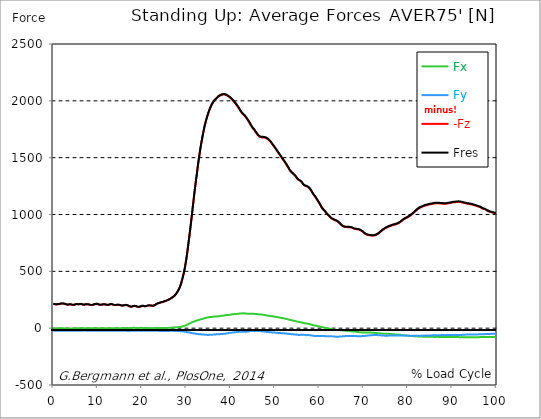
| Category |  Fx |  Fy |  -Fz |  Fres |
|---|---|---|---|---|
| 0.0 | -2.037 | -22.786 | 213.212 | 214.551 |
| 0.167348456675344 | -2.209 | -22.912 | 212.468 | 213.819 |
| 0.334696913350688 | -2.369 | -22.958 | 210.385 | 211.759 |
| 0.5020453700260321 | -2.129 | -22.763 | 208.932 | 210.294 |
| 0.669393826701376 | -1.762 | -22.511 | 208.783 | 210.111 |
| 0.83674228337672 | -1.511 | -22.271 | 209.825 | 211.118 |
| 1.0040907400520642 | -1.568 | -22.088 | 210.431 | 211.69 |
| 1.1621420602454444 | -1.534 | -21.848 | 210.065 | 211.29 |
| 1.3294905169207885 | -1.236 | -21.676 | 211.381 | 212.571 |
| 1.4968389735961325 | -1.019 | -21.676 | 213.727 | 214.883 |
| 1.6641874302714765 | -0.881 | -21.79 | 216.279 | 217.424 |
| 1.8315358869468206 | -1.053 | -21.859 | 217.103 | 218.259 |
| 1.9988843436221646 | -1.282 | -21.951 | 216.817 | 217.996 |
| 2.1662328002975086 | -1.293 | -21.996 | 215.982 | 217.161 |
| 2.333581256972853 | -1.362 | -22.065 | 215.776 | 216.977 |
| 2.5009297136481967 | -1.728 | -22.122 | 214.711 | 215.925 |
| 2.6682781703235405 | -2.312 | -22.157 | 212.217 | 213.464 |
| 2.8356266269988843 | -2.77 | -22.134 | 209.493 | 210.763 |
| 3.002975083674229 | -2.987 | -22.145 | 207.501 | 208.795 |
| 3.1703235403495724 | -2.884 | -22.088 | 206.403 | 207.719 |
| 3.337671997024917 | -2.792 | -22.054 | 206.368 | 207.684 |
| 3.4957233172182973 | -2.792 | -22.134 | 207.913 | 209.23 |
| 3.663071773893641 | -2.815 | -22.248 | 209.31 | 210.626 |
| 3.8304202305689854 | -3.033 | -22.328 | 209.378 | 210.694 |
| 3.997768687244329 | -3.25 | -22.328 | 208.131 | 209.458 |
| 4.165117143919673 | -3.479 | -22.305 | 206.117 | 207.444 |
| 4.332465600595017 | -3.41 | -22.157 | 204.388 | 205.716 |
| 4.499814057270361 | -3.09 | -21.905 | 203.713 | 205.006 |
| 4.667162513945706 | -2.449 | -21.642 | 204.938 | 206.162 |
| 4.834510970621049 | -1.74 | -21.516 | 207.25 | 208.428 |
| 5.001859427296393 | -1.431 | -21.687 | 209.79 | 210.969 |
| 5.169207883971737 | -1.316 | -21.825 | 211.69 | 212.869 |
| 5.336556340647081 | -1.442 | -21.905 | 212.159 | 213.35 |
| 5.503904797322425 | -1.545 | -21.985 | 211.221 | 212.434 |
| 5.671253253997769 | -1.568 | -22.065 | 209.676 | 210.912 |
| 5.82930457419115 | -1.179 | -21.996 | 209.47 | 210.694 |
| 5.996653030866494 | -0.721 | -21.882 | 211.438 | 212.64 |
| 6.164001487541838 | -0.492 | -21.825 | 213.269 | 214.46 |
| 6.331349944217181 | -0.824 | -21.859 | 212.732 | 213.922 |
| 6.498698400892526 | -1.282 | -21.916 | 210.042 | 211.267 |
| 6.66604685756787 | -1.408 | -21.859 | 206.78 | 208.028 |
| 6.833395314243213 | -1.099 | -21.699 | 205.338 | 206.586 |
| 7.000743770918558 | -0.629 | -21.516 | 205.659 | 206.872 |
| 7.168092227593902 | -0.183 | -21.504 | 208.028 | 209.218 |
| 7.335440684269246 | -0.149 | -21.642 | 210.099 | 211.301 |
| 7.50278914094459 | -0.229 | -21.687 | 211.026 | 212.228 |
| 7.6701375976199335 | -0.71 | -21.813 | 210.065 | 211.301 |
| 7.837486054295278 | -0.984 | -21.928 | 208.966 | 210.237 |
| 7.995537374488658 | -1.247 | -22.054 | 208.383 | 209.687 |
| 8.162885831164003 | -1.316 | -22.122 | 205.373 | 206.689 |
| 8.330234287839346 | -1.282 | -22.145 | 203.221 | 204.56 |
| 8.49758274451469 | -0.973 | -22.134 | 202.431 | 203.759 |
| 8.664931201190035 | -0.572 | -22.099 | 202.603 | 203.908 |
| 8.832279657865378 | -0.286 | -22.145 | 204.24 | 205.521 |
| 8.999628114540721 | 0 | -22.122 | 205.865 | 207.112 |
| 9.166976571216066 | 0.401 | -22.111 | 208.325 | 209.55 |
| 9.334325027891412 | 0.687 | -22.088 | 211.106 | 212.32 |
| 9.501673484566755 | 0.664 | -22.145 | 212.606 | 213.807 |
| 9.669021941242098 | 0.584 | -22.088 | 213.819 | 215.009 |
| 9.836370397917442 | 0.263 | -22.191 | 214.002 | 215.215 |
| 10.003718854592787 | -0.378 | -22.42 | 212.789 | 214.048 |
| 10.17106731126813 | -1.133 | -22.637 | 209.859 | 211.175 |
| 10.329118631461512 | -1.545 | -22.66 | 206.769 | 208.119 |
| 10.496467088136853 | -1.545 | -22.592 | 205.27 | 206.643 |
| 10.663815544812199 | -1.419 | -22.534 | 204.709 | 206.082 |
| 10.831164001487544 | -1.225 | -22.42 | 205.556 | 206.918 |
| 10.998512458162887 | -1.041 | -22.42 | 207.204 | 208.554 |
| 11.16586091483823 | -0.916 | -22.489 | 209.184 | 210.534 |
| 11.333209371513574 | -1.03 | -22.5 | 209.607 | 210.969 |
| 11.50055782818892 | -1.122 | -22.408 | 208.978 | 210.328 |
| 11.667906284864264 | -1.213 | -22.42 | 208.818 | 210.157 |
| 11.835254741539607 | -1.373 | -22.443 | 207.227 | 208.577 |
| 12.00260319821495 | -1.362 | -22.557 | 204.938 | 206.323 |
| 12.169951654890292 | -1.144 | -22.557 | 203.679 | 205.064 |
| 12.337300111565641 | -0.629 | -22.5 | 203.61 | 204.972 |
| 12.504648568240984 | -0.252 | -22.397 | 205.018 | 206.357 |
| 12.662699888434362 | 0.172 | -22.408 | 207.536 | 208.84 |
| 12.830048345109708 | 0.343 | -22.603 | 210.214 | 211.518 |
| 12.997396801785053 | 0.298 | -22.798 | 211.667 | 212.983 |
| 13.164745258460396 | 0.114 | -22.923 | 210.672 | 212.011 |
| 13.33209371513574 | -0.24 | -23.21 | 208.589 | 209.996 |
| 13.499442171811083 | -0.492 | -23.484 | 205.819 | 207.295 |
| 13.666790628486426 | -0.412 | -23.587 | 203.461 | 204.972 |
| 13.834139085161771 | -0.149 | -23.576 | 202.271 | 203.793 |
| 14.001487541837117 | 0.137 | -23.541 | 202.225 | 203.748 |
| 14.16883599851246 | 0.355 | -23.541 | 203.427 | 204.938 |
| 14.336184455187803 | 0.458 | -23.622 | 205.167 | 206.677 |
| 14.503532911863147 | 0.332 | -23.656 | 205.739 | 207.261 |
| 14.670881368538492 | 0.16 | -23.667 | 205.041 | 206.574 |
| 14.828932688731873 | 0.057 | -23.793 | 204.697 | 206.254 |
| 14.996281145407215 | -0.023 | -23.713 | 203.439 | 204.984 |
| 15.163629602082558 | -0.08 | -23.702 | 201.207 | 202.752 |
| 15.330978058757903 | 0.229 | -23.644 | 198.884 | 200.44 |
| 15.498326515433247 | 0.526 | -23.438 | 197.716 | 199.227 |
| 15.665674972108594 | 1.019 | -23.278 | 198.048 | 199.525 |
| 15.833023428783937 | 1.453 | -23.084 | 199.513 | 200.932 |
| 16.00037188545928 | 1.968 | -23.095 | 201.653 | 203.049 |
| 16.167720342134626 | 1.923 | -23.37 | 203.393 | 204.8 |
| 16.335068798809967 | 1.637 | -23.622 | 203.576 | 205.018 |
| 16.502417255485312 | 1.225 | -23.896 | 202.18 | 203.656 |
| 16.669765712160658 | 1.053 | -24.102 | 201.321 | 202.821 |
| 16.837114168836 | 0.664 | -24.171 | 198.495 | 200.04 |
| 17.004462625511344 | 0.263 | -24.148 | 194.878 | 196.457 |
| 17.16251394570472 | 0.172 | -23.976 | 191.445 | 193.047 |
| 17.32986240238007 | 0.412 | -23.702 | 189.167 | 190.747 |
| 17.497210859055414 | 1.019 | -23.267 | 188.069 | 189.602 |
| 17.664559315730756 | 1.659 | -22.855 | 189.087 | 190.552 |
| 17.8319077724061 | 2.335 | -22.523 | 191.33 | 192.738 |
| 17.999256229081443 | 2.941 | -22.34 | 193.699 | 195.073 |
| 18.166604685756788 | 2.964 | -22.408 | 195.336 | 196.698 |
| 18.333953142432133 | 2.792 | -22.466 | 195.771 | 197.144 |
| 18.501301599107478 | 2.461 | -22.534 | 195.164 | 196.537 |
| 18.668650055782823 | 1.946 | -22.614 | 193.093 | 194.5 |
| 18.835998512458165 | 1.545 | -22.569 | 190.312 | 191.731 |
| 19.00334696913351 | 1.236 | -22.431 | 187.473 | 188.893 |
| 19.170695425808855 | 1.362 | -22.214 | 185.917 | 187.325 |
| 19.338043882484197 | 1.808 | -21.905 | 186.008 | 187.37 |
| 19.496095202677576 | 2.243 | -21.71 | 188.137 | 189.476 |
| 19.66344365935292 | 2.644 | -21.607 | 190.918 | 192.223 |
| 19.830792116028263 | 2.724 | -21.825 | 194.077 | 195.393 |
| 19.998140572703612 | 2.564 | -21.974 | 195.725 | 197.052 |
| 20.165489029378953 | 2.129 | -22.168 | 196.412 | 197.751 |
| 20.3328374860543 | 1.637 | -22.34 | 195.324 | 196.698 |
| 20.500185942729644 | 1.282 | -22.351 | 193.596 | 194.97 |
| 20.667534399404985 | 0.927 | -22.363 | 191.857 | 193.253 |
| 20.83488285608033 | 1.019 | -22.351 | 192.406 | 193.791 |
| 21.002231312755672 | 1.11 | -22.466 | 194.283 | 195.668 |
| 21.16957976943102 | 1.144 | -22.729 | 196.629 | 198.025 |
| 21.336928226106362 | 1.041 | -23.049 | 198.735 | 200.154 |
| 21.504276682781704 | 0.744 | -23.324 | 199.696 | 201.15 |
| 21.67162513945705 | 0.309 | -23.473 | 199.387 | 200.875 |
| 21.82967645965043 | 0.034 | -23.61 | 199.101 | 200.6 |
| 21.997024916325774 | -0.217 | -23.725 | 198.483 | 199.994 |
| 22.16437337300112 | -0.423 | -23.702 | 196.938 | 198.472 |
| 22.33172182967646 | -0.492 | -23.633 | 195.977 | 197.499 |
| 22.499070286351806 | -0.034 | -23.393 | 197.018 | 198.495 |
| 22.666418743027148 | 0.435 | -23.21 | 198.552 | 199.994 |
| 22.833767199702496 | 0.835 | -23.129 | 200.967 | 202.386 |
| 23.00111565637784 | 1.202 | -23.152 | 204.915 | 206.3 |
| 23.168464113053183 | 1.419 | -23.393 | 210.088 | 211.473 |
| 23.335812569728528 | 1.305 | -23.622 | 214.402 | 215.799 |
| 23.50316102640387 | 1.247 | -23.736 | 217.447 | 218.832 |
| 23.670509483079215 | 0.973 | -23.805 | 218.9 | 220.296 |
| 23.83785793975456 | 0.595 | -23.873 | 219.804 | 221.223 |
| 23.995909259947936 | 0.641 | -23.965 | 222.391 | 223.798 |
| 24.163257716623285 | 0.629 | -24.194 | 225.927 | 227.358 |
| 24.330606173298627 | 0.813 | -24.159 | 227.815 | 229.235 |
| 24.49795462997397 | 1.03 | -24.079 | 228.651 | 230.059 |
| 24.665303086649313 | 1.247 | -23.999 | 229.509 | 230.906 |
| 24.83265154332466 | 1.499 | -24.056 | 232.039 | 233.446 |
| 25.0 | 1.82 | -24.045 | 234.911 | 236.296 |
| 25.167348456675345 | 2.06 | -23.976 | 237.292 | 238.665 |
| 25.334696913350694 | 2.209 | -23.931 | 238.997 | 240.359 |
| 25.502045370026035 | 2.186 | -24.079 | 242.751 | 244.113 |
| 25.669393826701377 | 2.197 | -23.965 | 244.593 | 245.932 |
| 25.836742283376722 | 2.312 | -23.885 | 247.1 | 248.427 |
| 26.004090740052067 | 2.529 | -23.862 | 250.201 | 251.529 |
| 26.17143919672741 | 2.735 | -23.85 | 253.325 | 254.653 |
| 26.329490516920792 | 3.113 | -23.839 | 256.805 | 258.132 |
| 26.49683897359613 | 3.605 | -23.805 | 260.879 | 262.218 |
| 26.66418743027148 | 4.154 | -23.793 | 265.811 | 267.15 |
| 26.831535886946828 | 4.727 | -23.77 | 270.069 | 271.408 |
| 26.998884343622166 | 5.276 | -23.759 | 274.269 | 275.619 |
| 27.166232800297514 | 5.837 | -23.839 | 279.11 | 280.472 |
| 27.333581256972852 | 6.386 | -23.976 | 284.26 | 285.633 |
| 27.5009297136482 | 6.935 | -24.125 | 289.628 | 291.012 |
| 27.668278170323543 | 7.347 | -24.377 | 299.802 | 301.198 |
| 27.835626626998888 | 7.405 | -24.64 | 309.884 | 311.292 |
| 28.002975083674233 | 7.828 | -24.846 | 320.059 | 321.478 |
| 28.170323540349575 | 8.458 | -25.064 | 331.663 | 333.071 |
| 28.33767199702492 | 9.087 | -25.453 | 342.364 | 343.795 |
| 28.50502045370026 | 9.957 | -26.048 | 357.414 | 358.879 |
| 28.663071773893645 | 11.25 | -26.334 | 374.432 | 375.931 |
| 28.830420230568986 | 12.303 | -27.101 | 393.991 | 395.536 |
| 28.99776868724433 | 13.608 | -27.879 | 416.948 | 418.528 |
| 29.165117143919673 | 15.13 | -28.589 | 442.664 | 444.301 |
| 29.33246560059502 | 17.327 | -28.966 | 469.078 | 470.784 |
| 29.499814057270367 | 19.147 | -30.076 | 498.079 | 499.864 |
| 29.66716251394571 | 21.378 | -31.015 | 531.371 | 533.248 |
| 29.834510970621054 | 23.942 | -31.896 | 568.051 | 570.008 |
| 30.00185942729639 | 26.54 | -33.029 | 608.942 | 610.979 |
| 30.169207883971744 | 29.493 | -33.956 | 651.585 | 653.725 |
| 30.33655634064708 | 32.72 | -35.615 | 702.536 | 704.802 |
| 30.50390479732243 | 36.657 | -36.668 | 753.247 | 755.696 |
| 30.671253253997772 | 39.976 | -37.973 | 803.912 | 806.544 |
| 30.829304574191156 | 43.444 | -39.461 | 855.321 | 858.125 |
| 30.996653030866494 | 46.213 | -41.338 | 909.705 | 912.658 |
| 31.164001487541842 | 49.967 | -42.391 | 964.994 | 968.107 |
| 31.331349944217187 | 53.068 | -43.672 | 1021.736 | 1024.964 |
| 31.498698400892525 | 55.758 | -44.977 | 1080.287 | 1083.594 |
| 31.666046857567874 | 58.081 | -46.03 | 1136.457 | 1139.81 |
| 31.833395314243212 | 60.29 | -47.003 | 1191.688 | 1195.087 |
| 32.00074377091856 | 62.052 | -48.136 | 1244.619 | 1248.064 |
| 32.1680922275939 | 64.49 | -49.338 | 1297.15 | 1300.663 |
| 32.33544068426925 | 67.088 | -50.276 | 1344.175 | 1347.78 |
| 32.50278914094459 | 69.102 | -51.203 | 1395.928 | 1399.567 |
| 32.670137597619934 | 70.968 | -52.244 | 1446.341 | 1450.003 |
| 32.83748605429528 | 72.696 | -53.194 | 1492.314 | 1496.033 |
| 33.004834510970625 | 74.779 | -53.824 | 1535.769 | 1539.546 |
| 33.162885831164004 | 76.907 | -54.453 | 1578.652 | 1582.474 |
| 33.33023428783935 | 78.521 | -54.682 | 1617.62 | 1621.443 |
| 33.497582744514695 | 80.066 | -54.865 | 1652.698 | 1656.543 |
| 33.664931201190036 | 82.103 | -54.842 | 1688.062 | 1691.953 |
| 33.83227965786538 | 84.289 | -55.197 | 1721.972 | 1725.943 |
| 33.99962811454073 | 86.612 | -56.193 | 1753.696 | 1757.782 |
| 34.16697657121607 | 88.878 | -57.452 | 1783.212 | 1787.423 |
| 34.33432502789141 | 90.652 | -58.127 | 1808.813 | 1813.105 |
| 34.50167348456676 | 92.049 | -58.745 | 1832.95 | 1837.299 |
| 34.6690219412421 | 93.124 | -59.043 | 1855.564 | 1859.936 |
| 34.83637039791744 | 94.212 | -59.134 | 1876.508 | 1880.903 |
| 35.00371885459279 | 95.505 | -59.18 | 1896.17 | 1900.587 |
| 35.17106731126814 | 96.42 | -58.974 | 1914.08 | 1918.509 |
| 35.338415767943474 | 97.325 | -58.665 | 1930.721 | 1935.161 |
| 35.49646708813686 | 98.103 | -58.184 | 1945.896 | 1950.348 |
| 35.6638155448122 | 98.835 | -57.646 | 1959.904 | 1964.345 |
| 35.831164001487544 | 99.579 | -57.074 | 1972.276 | 1976.716 |
| 35.998512458162885 | 100.598 | -56.719 | 1983.137 | 1987.6 |
| 36.165860914838234 | 101.777 | -56.376 | 1993.025 | 1997.523 |
| 36.333209371513576 | 102.795 | -55.872 | 2001.883 | 2006.392 |
| 36.50055782818892 | 103.711 | -55.334 | 2009.253 | 2013.797 |
| 36.667906284864266 | 103.39 | -54.613 | 2014.278 | 2018.764 |
| 36.83525474153961 | 103.093 | -54.259 | 2020.389 | 2024.818 |
| 37.002603198214956 | 103.367 | -54.133 | 2028.217 | 2032.623 |
| 37.1699516548903 | 104.146 | -53.629 | 2034.5 | 2038.918 |
| 37.337300111565646 | 105.073 | -53.16 | 2039.581 | 2044.022 |
| 37.50464856824098 | 106.137 | -52.656 | 2043.61 | 2048.062 |
| 37.66269988843437 | 107.59 | -52.428 | 2047.398 | 2051.907 |
| 37.83004834510971 | 108.655 | -51.958 | 2050.236 | 2054.768 |
| 37.99739680178505 | 109.009 | -51.146 | 2052.445 | 2056.966 |
| 38.16474525846039 | 109.25 | -50.493 | 2054.07 | 2058.568 |
| 38.33209371513574 | 109.982 | -50.093 | 2055.066 | 2059.564 |
| 38.49944217181109 | 111.836 | -49.532 | 2055.455 | 2060.01 |
| 38.666790628486424 | 113.107 | -48.891 | 2054.631 | 2059.232 |
| 38.83413908516178 | 114.171 | -47.861 | 2052.903 | 2057.527 |
| 39.001487541837115 | 114.972 | -46.682 | 2050.362 | 2054.997 |
| 39.16883599851246 | 115.407 | -45.366 | 2047.02 | 2051.644 |
| 39.336184455187805 | 115.762 | -44.233 | 2043.473 | 2048.096 |
| 39.503532911863154 | 116.036 | -42.448 | 2039.009 | 2043.61 |
| 39.670881368538495 | 117.124 | -41.429 | 2034.008 | 2038.632 |
| 39.83822982521384 | 118.44 | -41.075 | 2028.984 | 2033.665 |
| 39.996281145407224 | 119.561 | -40.296 | 2023.376 | 2028.103 |
| 40.163629602082565 | 120.706 | -39.163 | 2016.692 | 2021.465 |
| 40.33097805875791 | 121.701 | -38.385 | 2010.02 | 2014.838 |
| 40.498326515433256 | 122.64 | -37.698 | 2003.405 | 2008.258 |
| 40.6656749721086 | 123.269 | -37.149 | 1996.126 | 2001.002 |
| 40.83302342878393 | 123.773 | -36.657 | 1988.562 | 1993.471 |
| 41.00037188545929 | 124.277 | -36.085 | 1980.859 | 1985.792 |
| 41.16772034213463 | 124.814 | -35.135 | 1972.345 | 1977.312 |
| 41.33506879880997 | 125.364 | -34.208 | 1963.223 | 1968.236 |
| 41.50241725548531 | 125.856 | -33.613 | 1953.907 | 1958.977 |
| 41.66976571216066 | 126.44 | -33.04 | 1944.546 | 1949.662 |
| 41.837114168836 | 127.023 | -32.331 | 1934.829 | 1939.991 |
| 42.004462625511344 | 128.213 | -31.461 | 1923.488 | 1928.718 |
| 42.17181108218669 | 128.877 | -30.98 | 1913.016 | 1918.303 |
| 42.32986240238007 | 129.335 | -30.889 | 1902.785 | 1908.118 |
| 42.497210859055414 | 129.724 | -30.797 | 1893.24 | 1898.596 |
| 42.66455931573076 | 130.273 | -31.015 | 1886.545 | 1891.947 |
| 42.831907772406105 | 130.903 | -31.347 | 1879.415 | 1884.874 |
| 42.999256229081446 | 130.708 | -31.61 | 1873.441 | 1878.888 |
| 43.16660468575679 | 129.541 | -31.656 | 1867.341 | 1872.685 |
| 43.33395314243214 | 128.568 | -31.759 | 1860.588 | 1865.864 |
| 43.50130159910748 | 128.419 | -32.068 | 1851.032 | 1856.32 |
| 43.66865005578282 | 127.79 | -31.667 | 1841.304 | 1846.557 |
| 43.83599851245817 | 127.241 | -30.614 | 1831.508 | 1836.727 |
| 44.00334696913351 | 126.909 | -29.275 | 1821.883 | 1827.067 |
| 44.17069542580886 | 127.012 | -27.742 | 1811.056 | 1816.241 |
| 44.3380438824842 | 127.355 | -26.197 | 1799.852 | 1805.048 |
| 44.49609520267758 | 127.412 | -24.949 | 1788.591 | 1793.787 |
| 44.66344365935292 | 127.012 | -24.159 | 1777.238 | 1782.422 |
| 44.83079211602827 | 126.932 | -23.564 | 1767.292 | 1772.488 |
| 44.99814057270361 | 126.92 | -23.164 | 1757.908 | 1763.127 |
| 45.16548902937895 | 126.428 | -23.713 | 1750.48 | 1755.688 |
| 45.332837486054295 | 125.661 | -24.343 | 1743.465 | 1748.638 |
| 45.500185942729644 | 124.906 | -24.743 | 1732.97 | 1738.12 |
| 45.66753439940499 | 124.505 | -24.068 | 1723.254 | 1728.381 |
| 45.83488285608033 | 124.082 | -23.759 | 1714.018 | 1719.145 |
| 46.00223131275568 | 123.601 | -23.679 | 1705.068 | 1710.184 |
| 46.16957976943102 | 122.995 | -24.114 | 1696.771 | 1701.875 |
| 46.336928226106366 | 122.342 | -24.674 | 1690.11 | 1695.192 |
| 46.50427668278171 | 121.61 | -25.178 | 1685.613 | 1690.66 |
| 46.671625139457056 | 120.889 | -25.601 | 1681.504 | 1686.528 |
| 46.829676459650436 | 120.168 | -26.094 | 1677.979 | 1682.957 |
| 46.99702491632577 | 119.447 | -27.055 | 1677.933 | 1682.877 |
| 47.16437337300112 | 118.634 | -27.982 | 1678.139 | 1683.049 |
| 47.33172182967646 | 117.73 | -28.886 | 1678.62 | 1683.472 |
| 47.49907028635181 | 116.677 | -29.733 | 1677.453 | 1682.259 |
| 47.66641874302716 | 115.521 | -30.614 | 1676.171 | 1680.932 |
| 47.83376719970249 | 114.366 | -31.576 | 1675.793 | 1680.497 |
| 48.001115656377834 | 113.187 | -32.388 | 1672.989 | 1677.647 |
| 48.16846411305319 | 111.996 | -33.121 | 1668.846 | 1673.458 |
| 48.33581256972853 | 110.806 | -33.853 | 1664.703 | 1669.27 |
| 48.50316102640387 | 109.788 | -34.357 | 1659.073 | 1663.616 |
| 48.67050948307921 | 108.826 | -34.814 | 1653.087 | 1657.608 |
| 48.837857939754564 | 107.945 | -35.478 | 1646.518 | 1651.027 |
| 49.005206396429905 | 107.121 | -36.268 | 1639.663 | 1644.16 |
| 49.163257716623285 | 105.965 | -37.046 | 1630.988 | 1635.485 |
| 49.33060617329863 | 104.798 | -37.286 | 1621.008 | 1625.448 |
| 49.49795462997397 | 103.802 | -37.504 | 1612.367 | 1616.762 |
| 49.66530308664932 | 102.738 | -38.053 | 1604.059 | 1608.43 |
| 49.832651543324666 | 101.502 | -38.912 | 1595.658 | 1599.996 |
| 50.0 | 100.563 | -39.415 | 1586.239 | 1590.543 |
| 50.16734845667534 | 99.591 | -39.964 | 1576.992 | 1581.272 |
| 50.33469691335069 | 98.526 | -40.582 | 1567.882 | 1572.151 |
| 50.50204537002604 | 97.302 | -41.109 | 1557.88 | 1562.091 |
| 50.66939382670139 | 96.157 | -41.498 | 1547.946 | 1552.1 |
| 50.836742283376715 | 94.944 | -42.173 | 1538.47 | 1542.601 |
| 51.00409074005207 | 93.926 | -42.379 | 1529.12 | 1533.228 |
| 51.17143919672741 | 92.793 | -42.848 | 1520.822 | 1524.897 |
| 51.32949051692079 | 91.534 | -43.375 | 1510.305 | 1514.333 |
| 51.496838973596134 | 90.057 | -44.05 | 1500.256 | 1504.216 |
| 51.66418743027148 | 88.661 | -44.588 | 1490.849 | 1494.752 |
| 51.831535886946824 | 87.219 | -45.298 | 1482.037 | 1485.893 |
| 51.99888434362217 | 86.326 | -45.549 | 1473.27 | 1477.104 |
| 52.16623280029752 | 85.056 | -46.293 | 1463.817 | 1467.605 |
| 52.33358125697285 | 83.5 | -47.266 | 1454.055 | 1457.809 |
| 52.5009297136482 | 82.08 | -47.438 | 1444.601 | 1448.298 |
| 52.668278170323546 | 80.375 | -47.907 | 1433.134 | 1436.762 |
| 52.835626626998895 | 78.647 | -48.8 | 1422.365 | 1425.947 |
| 53.00297508367424 | 76.885 | -49.589 | 1411.893 | 1415.406 |
| 53.17032354034958 | 75.145 | -50.265 | 1401.066 | 1404.511 |
| 53.33767199702492 | 73.177 | -51.123 | 1389.221 | 1392.574 |
| 53.50502045370027 | 71.677 | -51.867 | 1380.352 | 1383.671 |
| 53.663071773893655 | 70.247 | -52.599 | 1372.215 | 1375.511 |
| 53.83042023056899 | 68.747 | -53.332 | 1367.007 | 1370.28 |
| 53.99776868724433 | 67.397 | -53.961 | 1361.079 | 1364.341 |
| 54.16511714391967 | 66.001 | -54.854 | 1354.43 | 1357.714 |
| 54.33246560059503 | 64.513 | -55.209 | 1349.039 | 1352.29 |
| 54.49981405727037 | 63.037 | -55.346 | 1343.26 | 1346.464 |
| 54.667162513945705 | 61.572 | -55.552 | 1336.645 | 1339.815 |
| 54.834510970621054 | 59.947 | -56.078 | 1326.745 | 1329.858 |
| 55.0018594272964 | 58.15 | -57.52 | 1316.193 | 1319.261 |
| 55.169207883971744 | 56.662 | -58.745 | 1308.594 | 1311.684 |
| 55.336556340647086 | 55.483 | -59.752 | 1303.696 | 1306.809 |
| 55.50390479732243 | 53.915 | -59.775 | 1300.526 | 1303.593 |
| 55.671253253997776 | 52.622 | -59.34 | 1296.955 | 1299.965 |
| 55.83860171067312 | 51.546 | -58.585 | 1293.064 | 1296.017 |
| 55.9966530308665 | 49.99 | -57.715 | 1285.739 | 1288.612 |
| 56.16400148754184 | 48.273 | -57.394 | 1276.458 | 1279.273 |
| 56.33134994421718 | 46.511 | -57.12 | 1267.966 | 1270.713 |
| 56.498698400892536 | 45.046 | -57.589 | 1260.23 | 1262.988 |
| 56.66604685756788 | 43.627 | -58.676 | 1254.587 | 1257.38 |
| 56.83339531424321 | 42.379 | -60.393 | 1251.967 | 1254.816 |
| 57.00074377091856 | 41.464 | -61.389 | 1250.731 | 1253.626 |
| 57.16809222759391 | 40.491 | -61.56 | 1248.43 | 1251.314 |
| 57.33544068426925 | 39.415 | -61.137 | 1244.928 | 1247.778 |
| 57.5027891409446 | 38.053 | -61.137 | 1240.762 | 1243.601 |
| 57.670137597619934 | 36.623 | -61.251 | 1236.104 | 1238.966 |
| 57.83748605429528 | 35.055 | -61.892 | 1227.59 | 1230.451 |
| 58.004834510970625 | 33.487 | -62.911 | 1219.292 | 1222.199 |
| 58.16288583116401 | 31.77 | -63.849 | 1209.885 | 1212.815 |
| 58.330234287839346 | 29.813 | -64.753 | 1198.543 | 1201.473 |
| 58.497582744514695 | 27.696 | -66.092 | 1187.19 | 1190.132 |
| 58.66493120119004 | 25.727 | -67.603 | 1176.719 | 1179.66 |
| 58.832279657865385 | 24.571 | -68.564 | 1168.261 | 1171.225 |
| 58.999628114540734 | 23.267 | -68.564 | 1159.403 | 1162.367 |
| 59.16697657121607 | 21.951 | -68.564 | 1150.556 | 1153.509 |
| 59.33432502789142 | 20.783 | -68.221 | 1140.703 | 1143.609 |
| 59.50167348456676 | 19.158 | -68.198 | 1130.116 | 1132.966 |
| 59.66902194124211 | 17.281 | -68.85 | 1119.461 | 1122.323 |
| 59.83637039791745 | 15.885 | -69.549 | 1110.203 | 1113.11 |
| 60.00371885459278 | 14.489 | -69.732 | 1098.85 | 1101.757 |
| 60.17106731126813 | 13.447 | -69.594 | 1087.382 | 1090.278 |
| 60.33841576794349 | 11.651 | -69.537 | 1074.667 | 1077.551 |
| 60.49646708813685 | 10.174 | -69.091 | 1063.44 | 1066.301 |
| 60.6638155448122 | 8.881 | -68.633 | 1053.392 | 1056.242 |
| 60.831164001487544 | 7.862 | -68.221 | 1046.205 | 1049.032 |
| 60.99851245816289 | 6.214 | -68.805 | 1039.59 | 1042.417 |
| 61.16586091483824 | 4.452 | -69.594 | 1033.089 | 1035.928 |
| 61.333209371513576 | 2.495 | -70.396 | 1025.17 | 1028.019 |
| 61.50055782818892 | 1.144 | -70.808 | 1015.957 | 1018.829 |
| 61.667906284864266 | -0.446 | -70.865 | 1007.099 | 1009.971 |
| 61.835254741539615 | -1.614 | -70.842 | 1000.037 | 1002.91 |
| 62.002603198214956 | -2.644 | -70.956 | 993.857 | 996.753 |
| 62.16995165489029 | -4.189 | -71.254 | 987.654 | 990.561 |
| 62.33730011156564 | -5.505 | -71.586 | 981.818 | 984.759 |
| 62.504648568240995 | -6.489 | -71.723 | 974.596 | 977.595 |
| 62.67199702491633 | -7.702 | -71.597 | 967.638 | 970.636 |
| 62.83004834510971 | -8.915 | -71.62 | 963.186 | 966.207 |
| 62.99739680178505 | -10.083 | -72.169 | 959.672 | 962.74 |
| 63.1647452584604 | -11.227 | -72.822 | 956.125 | 959.238 |
| 63.33209371513575 | -12.349 | -73.44 | 953.309 | 956.491 |
| 63.4994421718111 | -13.459 | -74.058 | 950.654 | 953.893 |
| 63.666790628486424 | -14.432 | -74.641 | 948.285 | 951.581 |
| 63.83413908516177 | -15.107 | -75.122 | 945.916 | 949.269 |
| 64.00148754183712 | -15.736 | -75.42 | 941.762 | 945.149 |
| 64.16883599851248 | -16.297 | -75.202 | 936.669 | 940.068 |
| 64.3361844551878 | -16.675 | -74.676 | 932.194 | 935.582 |
| 64.50353291186315 | -17.007 | -74.172 | 926.38 | 929.756 |
| 64.6708813685385 | -17.384 | -73.703 | 919.605 | 922.958 |
| 64.83822982521384 | -18.22 | -73.302 | 913.105 | 916.446 |
| 65.00557828188919 | -18.964 | -72.707 | 906.249 | 909.568 |
| 65.16362960208257 | -19.467 | -71.849 | 900.676 | 903.949 |
| 65.3309780587579 | -20.245 | -71.288 | 896.556 | 899.806 |
| 65.49832651543326 | -21.047 | -70.636 | 893.614 | 896.83 |
| 65.6656749721086 | -21.653 | -70.201 | 891.451 | 894.656 |
| 65.83302342878395 | -22.145 | -69.915 | 889.975 | 893.168 |
| 66.00037188545929 | -22.717 | -69.686 | 889.357 | 892.539 |
| 66.16772034213463 | -23.53 | -69.411 | 889.357 | 892.539 |
| 66.33506879880998 | -24.262 | -69.469 | 888.602 | 891.795 |
| 66.50241725548531 | -24.732 | -69.377 | 888.19 | 891.383 |
| 66.66976571216065 | -25.27 | -69.217 | 888.27 | 891.463 |
| 66.83711416883601 | -25.762 | -69.091 | 888.19 | 891.383 |
| 67.00446262551135 | -26.208 | -69.056 | 887.72 | 890.925 |
| 67.1718110821867 | -26.769 | -69.148 | 886.21 | 889.437 |
| 67.32986240238007 | -27.433 | -69.274 | 884.276 | 887.549 |
| 67.49721085905541 | -28.36 | -69.4 | 880.705 | 884.024 |
| 67.66455931573076 | -28.886 | -69.606 | 877.111 | 880.476 |
| 67.83190777240611 | -29.653 | -69.48 | 874.845 | 878.233 |
| 67.99925622908145 | -30.557 | -69.251 | 873.358 | 876.768 |
| 68.16660468575678 | -31.553 | -69.457 | 872.122 | 875.589 |
| 68.33395314243214 | -32.457 | -69.709 | 870.874 | 874.399 |
| 68.50130159910749 | -32.777 | -70.19 | 869.615 | 873.197 |
| 68.66865005578282 | -33.258 | -70.521 | 868.837 | 872.476 |
| 68.83599851245816 | -33.945 | -70.67 | 868.265 | 871.95 |
| 69.00334696913352 | -35.009 | -70.647 | 866.525 | 870.268 |
| 69.17069542580886 | -35.329 | -70.579 | 863.584 | 867.349 |
| 69.3380438824842 | -36.233 | -70.67 | 859.727 | 863.561 |
| 69.50539233915956 | -36.932 | -70.018 | 856.053 | 859.887 |
| 69.66344365935292 | -37.927 | -69.617 | 852.208 | 856.065 |
| 69.83079211602826 | -38.419 | -69.159 | 846.463 | 850.331 |
| 69.99814057270362 | -38.66 | -68.633 | 840.741 | 844.609 |
| 70.16548902937896 | -38.82 | -68.164 | 834.297 | 838.166 |
| 70.33283748605429 | -38.809 | -67.626 | 829.422 | 833.279 |
| 70.50018594272964 | -38.889 | -67.111 | 825.931 | 829.754 |
| 70.667534399405 | -39.049 | -66.516 | 823.322 | 827.121 |
| 70.83488285608033 | -38.74 | -65.669 | 820.964 | 824.672 |
| 71.00223131275568 | -38.614 | -64.822 | 819.557 | 823.196 |
| 71.16957976943102 | -38.797 | -63.884 | 818.744 | 822.303 |
| 71.33692822610637 | -39.003 | -63.117 | 817.382 | 820.896 |
| 71.50427668278171 | -39.095 | -62.613 | 815.711 | 819.19 |
| 71.67162513945706 | -39.186 | -62.178 | 815.116 | 818.561 |
| 71.8389735961324 | -39.415 | -61.652 | 814.681 | 818.092 |
| 71.99702491632577 | -39.827 | -61.286 | 814.017 | 817.417 |
| 72.16437337300113 | -40.262 | -61 | 813.445 | 816.844 |
| 72.33172182967647 | -40.64 | -60.668 | 814.567 | 817.954 |
| 72.49907028635181 | -41.395 | -60.748 | 816.615 | 820.037 |
| 72.66641874302715 | -42.07 | -60.748 | 818.733 | 822.177 |
| 72.8337671997025 | -42.505 | -60.507 | 821.125 | 824.569 |
| 73.00111565637783 | -43.341 | -60.885 | 825.222 | 828.712 |
| 73.16846411305319 | -44.084 | -61.206 | 829.113 | 832.638 |
| 73.33581256972853 | -44.771 | -61.457 | 832.821 | 836.403 |
| 73.50316102640387 | -45.092 | -61.881 | 837.719 | 841.324 |
| 73.67050948307921 | -45.526 | -62.419 | 843.167 | 846.818 |
| 73.83785793975457 | -46.431 | -63.277 | 849.919 | 853.65 |
| 74.00520639642991 | -46.625 | -63.735 | 854.852 | 858.605 |
| 74.16325771662328 | -47.323 | -64.33 | 860.849 | 864.66 |
| 74.33060617329863 | -48.182 | -64.822 | 865.735 | 869.615 |
| 74.49795462997398 | -48.754 | -65.131 | 869.97 | 873.884 |
| 74.66530308664932 | -49.017 | -65.703 | 873.472 | 877.432 |
| 74.83265154332466 | -49.624 | -66.15 | 877.306 | 881.312 |
| 75.00000000000001 | -49.887 | -66.31 | 881.598 | 885.626 |
| 75.16734845667534 | -50.081 | -66.905 | 884.733 | 888.808 |
| 75.3346969133507 | -50.207 | -66.516 | 888.338 | 892.39 |
| 75.50204537002605 | -50.127 | -65.829 | 891.451 | 895.446 |
| 75.66939382670138 | -50.173 | -65.383 | 894.278 | 898.249 |
| 75.83674228337672 | -50.425 | -65.28 | 896.888 | 900.859 |
| 76.00409074005208 | -50.871 | -65.406 | 898.845 | 902.85 |
| 76.17143919672742 | -51.478 | -65.52 | 901.523 | 905.551 |
| 76.33878765340276 | -52.164 | -65.383 | 904.338 | 908.378 |
| 76.49683897359614 | -52.725 | -65.12 | 906.215 | 910.255 |
| 76.66418743027148 | -53.435 | -64.605 | 908.275 | 912.326 |
| 76.83153588694682 | -53.892 | -64.444 | 909.66 | 913.723 |
| 76.99888434362218 | -54.316 | -64.341 | 910.953 | 915.039 |
| 77.16623280029752 | -54.716 | -64.273 | 912.429 | 916.538 |
| 77.33358125697285 | -55.071 | -64.307 | 914.478 | 918.609 |
| 77.5009297136482 | -55.575 | -64.238 | 917.213 | 921.379 |
| 77.66827817032356 | -56.147 | -64.124 | 920.601 | 924.778 |
| 77.83562662699889 | -56.788 | -64.238 | 923.714 | 927.914 |
| 78.00297508367423 | -57.394 | -64.307 | 927.055 | 931.301 |
| 78.17032354034959 | -57.932 | -64.65 | 930.02 | 934.3 |
| 78.33767199702493 | -58.55 | -64.65 | 934.712 | 939.015 |
| 78.50502045370027 | -59.191 | -64.685 | 939.976 | 944.291 |
| 78.67236891037561 | -60.416 | -64.845 | 946.511 | 950.883 |
| 78.83042023056899 | -61.595 | -64.856 | 952.165 | 956.594 |
| 78.99776868724433 | -62.751 | -64.845 | 956.159 | 960.634 |
| 79.16511714391969 | -63.906 | -65.051 | 960.062 | 964.605 |
| 79.33246560059503 | -64.284 | -65.165 | 963.266 | 967.821 |
| 79.49981405727036 | -64.845 | -65.165 | 966.745 | 971.323 |
| 79.66716251394571 | -65.429 | -65.303 | 970.087 | 974.699 |
| 79.83451097062107 | -65.68 | -65.6 | 973.269 | 977.904 |
| 80.00185942729641 | -66.15 | -65.806 | 977.08 | 981.749 |
| 80.16920788397174 | -66.676 | -66.012 | 981.028 | 985.72 |
| 80.33655634064709 | -67.191 | -66.069 | 985.262 | 989.978 |
| 80.50390479732243 | -67.832 | -66.275 | 989.783 | 994.521 |
| 80.67125325399778 | -68.53 | -66.584 | 994.887 | 999.671 |
| 80.83860171067312 | -68.908 | -66.905 | 999.648 | 1004.455 |
| 80.99665303086651 | -69.434 | -66.905 | 1004.913 | 1009.731 |
| 81.16400148754184 | -70.098 | -67.054 | 1010.383 | 1015.236 |
| 81.3313499442172 | -70.464 | -66.962 | 1016.54 | 1021.393 |
| 81.49869840089255 | -70.819 | -66.539 | 1022.457 | 1027.287 |
| 81.66604685756786 | -71.231 | -66.161 | 1028.546 | 1033.341 |
| 81.83339531424322 | -71.609 | -66.573 | 1035.023 | 1039.853 |
| 82.00074377091858 | -71.986 | -66.699 | 1041.043 | 1045.884 |
| 82.16809222759392 | -72.272 | -66.367 | 1046.502 | 1051.32 |
| 82.33544068426926 | -72.593 | -66.138 | 1051.126 | 1055.944 |
| 82.50278914094459 | -72.73 | -66.115 | 1055.189 | 1060.007 |
| 82.67013759761994 | -72.833 | -66.104 | 1059.171 | 1063.978 |
| 82.83748605429528 | -73.074 | -65.806 | 1062.456 | 1067.251 |
| 83.00483451097062 | -73.36 | -65.612 | 1065.008 | 1069.803 |
| 83.17218296764597 | -73.886 | -65.749 | 1067.766 | 1072.596 |
| 83.33023428783935 | -74.481 | -65.944 | 1070.101 | 1074.988 |
| 83.4975827445147 | -74.767 | -65.303 | 1073.397 | 1078.25 |
| 83.66493120119004 | -74.584 | -65.12 | 1076.167 | 1080.996 |
| 83.83227965786537 | -74.939 | -65.188 | 1078.009 | 1082.85 |
| 83.99962811454073 | -75.294 | -65.154 | 1079.898 | 1084.762 |
| 84.16697657121607 | -75.282 | -65.268 | 1081.5 | 1086.364 |
| 84.33432502789142 | -75.408 | -65.039 | 1083.285 | 1088.138 |
| 84.50167348456677 | -75.832 | -65.005 | 1085.277 | 1090.14 |
| 84.6690219412421 | -76.164 | -64.971 | 1086.844 | 1091.72 |
| 84.83637039791745 | -76.198 | -64.788 | 1088.241 | 1093.127 |
| 85.0037188545928 | -76.141 | -64.284 | 1090.106 | 1094.959 |
| 85.17106731126813 | -75.935 | -63.632 | 1091.788 | 1096.595 |
| 85.33841576794349 | -75.923 | -63.231 | 1092.475 | 1097.259 |
| 85.50576422461883 | -76.141 | -63.037 | 1093.242 | 1098.037 |
| 85.66381554481221 | -76.473 | -62.854 | 1094.695 | 1099.502 |
| 85.83116400148755 | -76.885 | -62.167 | 1096.298 | 1101.093 |
| 85.99851245816289 | -76.816 | -61.778 | 1097.637 | 1102.409 |
| 86.16586091483823 | -76.724 | -61.412 | 1098.964 | 1103.714 |
| 86.33320937151358 | -76.759 | -61.331 | 1099.433 | 1104.194 |
| 86.50055782818893 | -76.724 | -61.32 | 1099.685 | 1104.446 |
| 86.66790628486427 | -76.427 | -61.32 | 1099.308 | 1104.046 |
| 86.83525474153961 | -76.598 | -61.251 | 1098.598 | 1103.336 |
| 87.00260319821496 | -76.804 | -61.286 | 1098.072 | 1102.821 |
| 87.16995165489031 | -76.896 | -61.377 | 1097.625 | 1102.375 |
| 87.33730011156564 | -76.988 | -61.331 | 1097.053 | 1101.814 |
| 87.504648568241 | -77.205 | -60.919 | 1096.309 | 1101.059 |
| 87.67199702491634 | -77.068 | -60.839 | 1095.519 | 1100.246 |
| 87.83004834510972 | -77.091 | -60.771 | 1095.096 | 1099.823 |
| 87.99739680178506 | -77.251 | -60.702 | 1095.016 | 1099.742 |
| 88.1647452584604 | -77.297 | -60.794 | 1095.027 | 1099.765 |
| 88.33209371513574 | -77.274 | -60.851 | 1094.936 | 1099.674 |
| 88.49944217181108 | -77.091 | -60.816 | 1094.695 | 1099.399 |
| 88.66679062848644 | -77.171 | -60.725 | 1095.428 | 1100.132 |
| 88.83413908516178 | -77.159 | -60.782 | 1096.481 | 1101.173 |
| 89.00148754183712 | -77.148 | -60.736 | 1097.717 | 1102.398 |
| 89.16883599851246 | -77.091 | -60.725 | 1098.964 | 1103.622 |
| 89.33618445518782 | -77.033 | -60.771 | 1099.914 | 1104.572 |
| 89.50353291186315 | -77.262 | -60.954 | 1101.093 | 1105.774 |
| 89.6708813685385 | -77.628 | -61.068 | 1102.317 | 1107.033 |
| 89.83822982521386 | -77.892 | -60.908 | 1104.332 | 1109.047 |
| 90.00557828188919 | -77.983 | -61.045 | 1105.774 | 1110.489 |
| 90.16362960208257 | -78.246 | -61.034 | 1106.872 | 1111.599 |
| 90.3309780587579 | -78.201 | -61 | 1107.559 | 1112.274 |
| 90.49832651543326 | -77.972 | -61.011 | 1107.902 | 1112.606 |
| 90.66567497210859 | -78.075 | -60.908 | 1108.189 | 1112.892 |
| 90.83302342878395 | -78.452 | -60.816 | 1109.299 | 1114.025 |
| 91.00037188545929 | -78.441 | -60.702 | 1110.077 | 1114.781 |
| 91.16772034213463 | -78.464 | -60.851 | 1110.58 | 1115.296 |
| 91.33506879880998 | -78.452 | -61.034 | 1111.038 | 1115.765 |
| 91.50241725548533 | -78.945 | -60.622 | 1110.821 | 1115.559 |
| 91.66976571216065 | -79.322 | -60.439 | 1110.546 | 1115.296 |
| 91.83711416883601 | -79.242 | -60.107 | 1109.344 | 1114.071 |
| 92.00446262551137 | -79.162 | -59.683 | 1107.857 | 1112.56 |
| 92.1718110821867 | -79.185 | -59.18 | 1106.083 | 1110.752 |
| 92.33915953886203 | -79.357 | -58.665 | 1104.515 | 1109.184 |
| 92.49721085905541 | -79.608 | -58.127 | 1103.061 | 1107.731 |
| 92.66455931573077 | -79.849 | -57.6 | 1101.608 | 1106.266 |
| 92.83190777240611 | -79.963 | -57.257 | 1100.029 | 1104.686 |
| 92.99925622908145 | -80.02 | -56.776 | 1098.976 | 1103.599 |
| 93.1666046857568 | -79.917 | -56.319 | 1096.904 | 1101.505 |
| 93.33395314243214 | -79.803 | -56.296 | 1095.348 | 1099.948 |
| 93.50130159910749 | -80.101 | -56.078 | 1094.638 | 1099.25 |
| 93.66865005578283 | -80.261 | -55.861 | 1093.929 | 1098.552 |
| 93.83599851245818 | -79.986 | -55.884 | 1092.624 | 1097.236 |
| 94.00334696913353 | -79.826 | -55.758 | 1091.674 | 1096.263 |
| 94.17069542580886 | -79.357 | -55.712 | 1090.484 | 1095.039 |
| 94.3380438824842 | -79.482 | -55.746 | 1088.882 | 1093.448 |
| 94.50539233915954 | -79.597 | -55.838 | 1086.867 | 1091.457 |
| 94.66344365935292 | -79.54 | -55.827 | 1085.013 | 1089.614 |
| 94.83079211602828 | -79.574 | -55.849 | 1082.988 | 1087.611 |
| 94.99814057270362 | -79.597 | -55.804 | 1081.065 | 1085.689 |
| 95.16548902937897 | -79.563 | -55.529 | 1078.467 | 1083.091 |
| 95.33283748605432 | -79.585 | -55.174 | 1076.933 | 1081.546 |
| 95.50018594272963 | -79.231 | -54.934 | 1075.274 | 1079.852 |
| 95.66753439940499 | -79.116 | -54.842 | 1072.436 | 1077.014 |
| 95.83488285608034 | -79.128 | -54.751 | 1069.655 | 1074.233 |
| 96.00223131275567 | -79.025 | -54.453 | 1068.224 | 1072.779 |
| 96.16957976943102 | -78.876 | -54.419 | 1066.462 | 1071.017 |
| 96.33692822610638 | -78.624 | -54.121 | 1064.15 | 1068.682 |
| 96.50427668278171 | -78.601 | -53.87 | 1059.297 | 1063.841 |
| 96.67162513945706 | -78.304 | -53.549 | 1054.983 | 1059.492 |
| 96.8389735961324 | -78.441 | -53.046 | 1051.95 | 1056.459 |
| 96.99702491632577 | -78.521 | -52.668 | 1049.775 | 1054.273 |
| 97.16437337300111 | -78.304 | -52.634 | 1048.62 | 1053.117 |
| 97.33172182967647 | -78.349 | -52.611 | 1046.216 | 1050.714 |
| 97.49907028635181 | -78.166 | -52.222 | 1042.657 | 1047.132 |
| 97.66641874302715 | -77.983 | -51.787 | 1038.697 | 1043.172 |
| 97.8337671997025 | -77.937 | -51.375 | 1035.012 | 1039.475 |
| 98.00111565637785 | -77.995 | -50.986 | 1031.567 | 1036.031 |
| 98.16846411305319 | -77.869 | -50.677 | 1028.202 | 1032.666 |
| 98.33581256972855 | -77.709 | -50.39 | 1024.861 | 1029.313 |
| 98.50316102640389 | -77.628 | -50.265 | 1022.972 | 1027.424 |
| 98.67050948307921 | -77.628 | -50.196 | 1020.947 | 1025.399 |
| 98.83785793975456 | -77.731 | -50.15 | 1018.829 | 1023.304 |
| 99.0052063964299 | -77.606 | -50.07 | 1017.628 | 1022.103 |
| 99.17255485310525 | -77.422 | -50.07 | 1016.54 | 1021.004 |
| 99.33060617329863 | -77.514 | -49.944 | 1014.24 | 1018.715 |
| 99.49795462997399 | -77.48 | -49.681 | 1012.077 | 1016.54 |
| 99.66530308664933 | -77.388 | -49.624 | 1009.639 | 1014.126 |
| 99.83265154332467 | -77.674 | -49.532 | 1008.106 | 1012.615 |
| 100.0 | -78.029 | -49.395 | 1007.087 | 1011.631 |